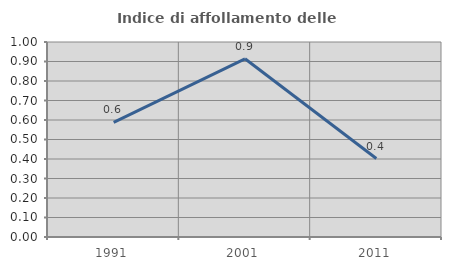
| Category | Indice di affollamento delle abitazioni  |
|---|---|
| 1991.0 | 0.588 |
| 2001.0 | 0.914 |
| 2011.0 | 0.402 |